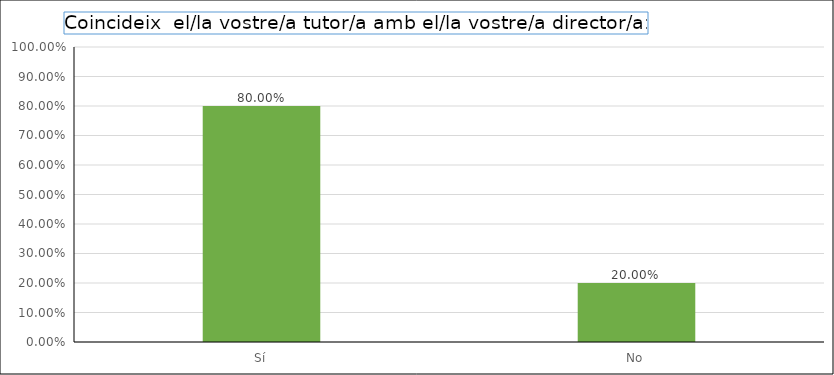
| Category | Series 0 |
|---|---|
| Sí | 0.8 |
| No | 0.2 |